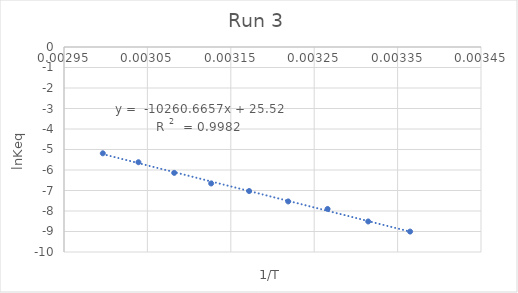
| Category | SIEt repeat-2 |
|---|---|
| 0.003364963994885255 | -9.004 |
| 0.003314770617873243 | -8.511 |
| 0.0032660526487686982 | -7.9 |
| 0.0032188495831589788 | -7.534 |
| 0.003171985028230667 | -7.027 |
| 0.0031264655307175235 | -6.657 |
| 0.0030821390044691015 | -6.141 |
| 0.0030392365437802026 | -5.621 |
| 0.002996524032122737 | -5.186 |